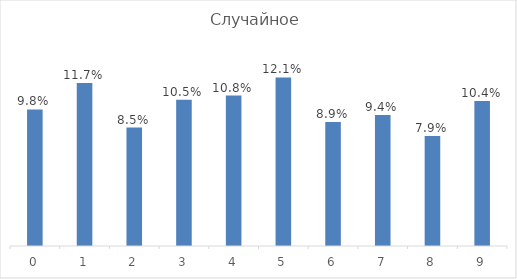
| Category | Series 0 |
|---|---|
| 0.0 | 0.098 |
| 1.0 | 0.117 |
| 2.0 | 0.085 |
| 3.0 | 0.105 |
| 4.0 | 0.108 |
| 5.0 | 0.121 |
| 6.0 | 0.089 |
| 7.0 | 0.094 |
| 8.0 | 0.079 |
| 9.0 | 0.104 |